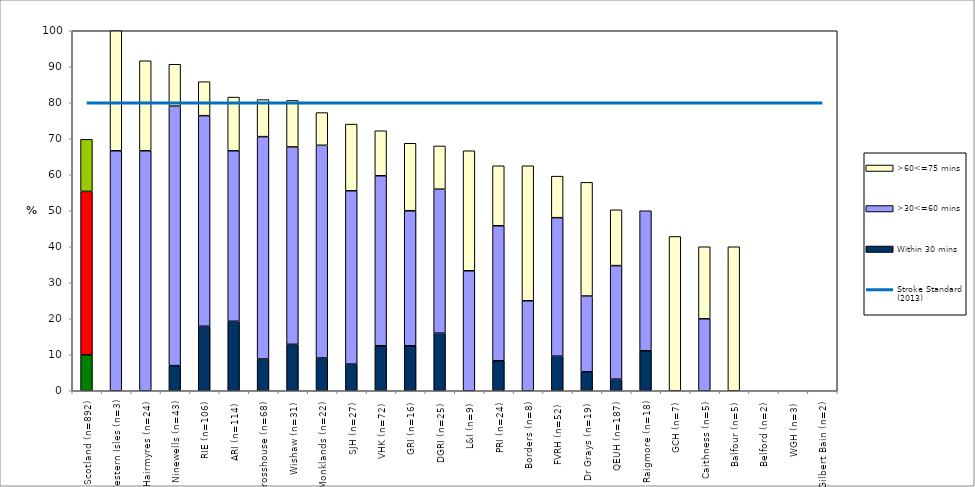
| Category | Within 30 mins | >30<=60 mins | >60<=75 mins |
|---|---|---|---|
| Scotland (n=892) | 9.978 | 45.404 | 14.462 |
| Western Isles (n=3) | 0 | 66.667 | 33.333 |
| Hairmyres (n=24) | 0 | 66.667 | 25 |
| Ninewells (n=43) | 6.977 | 72.093 | 11.628 |
| RIE (n=106) | 17.925 | 58.491 | 9.434 |
| ARI (n=114) | 19.298 | 47.368 | 14.912 |
| Crosshouse (n=68) | 8.824 | 61.765 | 10.294 |
| Wishaw (n=31) | 12.903 | 54.839 | 12.903 |
| Monklands (n=22) | 9.091 | 59.091 | 9.091 |
| SJH (n=27) | 7.407 | 48.148 | 18.519 |
| VHK (n=72) | 12.5 | 47.222 | 12.5 |
| GRI (n=16) | 12.5 | 37.5 | 18.75 |
| DGRI (n=25) | 16 | 40 | 12 |
| L&I (n=9) | 0 | 33.333 | 33.333 |
| PRI (n=24) | 8.333 | 37.5 | 16.667 |
| Borders (n=8) | 0 | 25 | 37.5 |
| FVRH (n=52) | 9.615 | 38.462 | 11.538 |
| Dr Grays (n=19) | 5.263 | 21.053 | 31.579 |
| QEUH (n=187) | 3.209 | 31.551 | 15.508 |
| Raigmore (n=18) | 11.111 | 38.889 | 0 |
| GCH (n=7) | 0 | 0 | 42.857 |
| Caithness (n=5) | 0 | 20 | 20 |
| Balfour (n=5) | 0 | 0 | 40 |
| Belford (n=2) | 0 | 0 | 0 |
| WGH (n=3) | 0 | 0 | 0 |
| Gilbert Bain (n=2) | 0 | 0 | 0 |